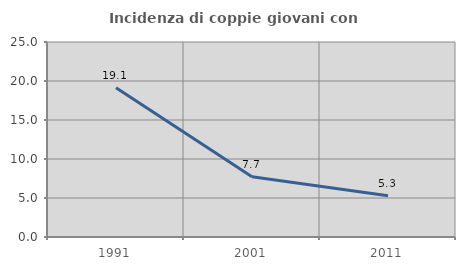
| Category | Incidenza di coppie giovani con figli |
|---|---|
| 1991.0 | 19.124 |
| 2001.0 | 7.724 |
| 2011.0 | 5.285 |